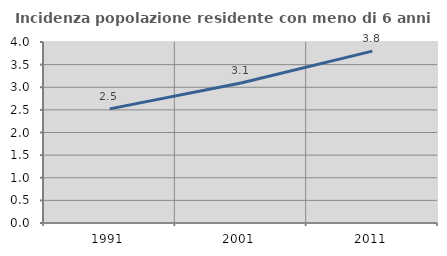
| Category | Incidenza popolazione residente con meno di 6 anni |
|---|---|
| 1991.0 | 2.522 |
| 2001.0 | 3.093 |
| 2011.0 | 3.799 |